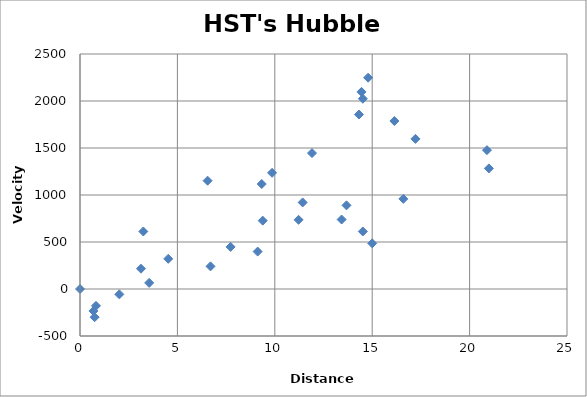
| Category | Series 0 |
|---|---|
| 0.69 | -234 |
| 0.75 | -300 |
| 0.82 | -179 |
| 2.02 | -57 |
| 3.13 | 216 |
| 3.25 | 612 |
| 3.55 | 65 |
| 4.53 | 321 |
| 6.55 | 1152 |
| 6.7 | 241 |
| 7.73 | 448 |
| 9.12 | 398 |
| 9.33 | 1117 |
| 9.38 | 727 |
| 9.86 | 1236 |
| 11.22 | 736 |
| 11.43 | 921 |
| 11.91 | 1446 |
| 13.43 | 739 |
| 13.68 | 890 |
| 14.32 | 1856 |
| 14.45 | 2097 |
| 14.52 | 2024 |
| 14.52 | 612 |
| 14.79 | 2248 |
| 15.0 | 486 |
| 16.14 | 1787 |
| 16.6 | 959 |
| 17.22 | 1597 |
| 20.89 | 1477 |
| 20.99 | 1283 |
| 0.0 | 0 |